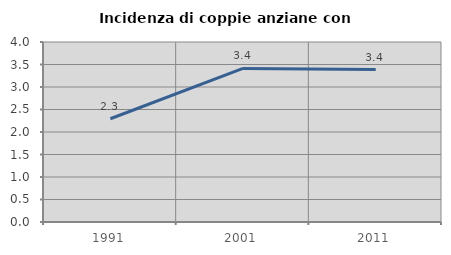
| Category | Incidenza di coppie anziane con figli |
|---|---|
| 1991.0 | 2.294 |
| 2001.0 | 3.414 |
| 2011.0 | 3.387 |